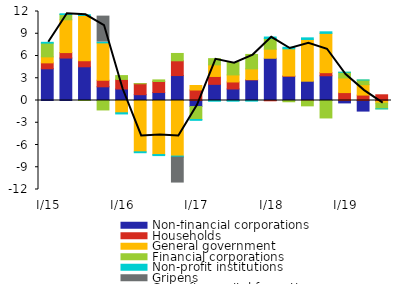
| Category | Non-financial corporations | Households | General government | Financial corporations | Non-profit institutions | Gripens |
|---|---|---|---|---|---|---|
|  I/15 | 4.278 | 0.798 | 0.809 | 1.849 | 0.111 | 0 |
| II | 5.724 | 0.738 | 4.42 | 0.713 | 0.097 | 0 |
| III | 4.547 | 0.815 | 6.097 | -0.004 | 0.104 | 0 |
| IV | 1.849 | 0.883 | 5.042 | -1.273 | 0.104 | 3.5 |
|  I/16 | 1.549 | 1.292 | -1.657 | 0.516 | -0.156 | 0 |
| II | 0.783 | 1.476 | -6.917 | 0.005 | -0.124 | 0 |
| III | 1.084 | 1.478 | -7.287 | 0.214 | -0.14 | 0 |
| IV | 3.364 | 1.99 | -7.495 | 0.989 | -0.137 | -3.5 |
|  I/17 | -0.817 | 1.416 | 0.609 | -1.747 | -0.111 | 0 |
| II | 2.179 | 1.06 | 1.565 | 0.838 | -0.096 | 0 |
| III | 1.554 | 0.946 | 0.951 | 1.668 | -0.093 | 0 |
| IV | 2.776 | 0.043 | 1.443 | 1.948 | -0.085 | 0 |
|  I/18 | 5.695 | -0.039 | 1.223 | 1.445 | 0.194 | 0 |
| II | 3.266 | 0.048 | 3.651 | -0.17 | 0.213 | 0 |
| III | 2.602 | -0.04 | 5.627 | -0.681 | 0.217 | 0 |
| IV | 3.338 | 0.414 | 5.298 | -2.354 | 0.21 | 0 |
|  I/19 | -0.324 | 1.067 | 1.972 | 0.765 | 0.009 | 0 |
| II | -1.427 | 0.731 | 1.406 | 0.623 | 0.004 | 0 |
| III | -0.117 | 0.77 | -0.241 | -0.766 | -0.006 | 0 |